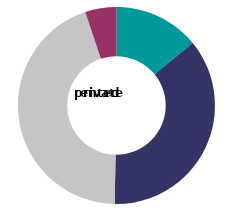
| Category | private rented |
|---|---|
| two or more bedrooms above the number required | 14.069 |
| one bedroom above the number required | 36.231 |
| room required met rooms available | 44.564 |
| overcrowded | 5.136 |